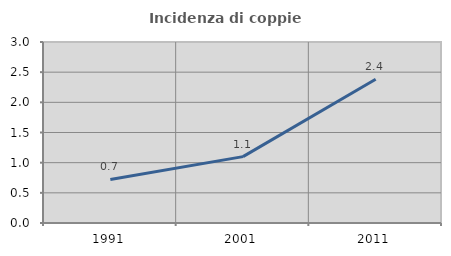
| Category | Incidenza di coppie miste |
|---|---|
| 1991.0 | 0.722 |
| 2001.0 | 1.1 |
| 2011.0 | 2.383 |